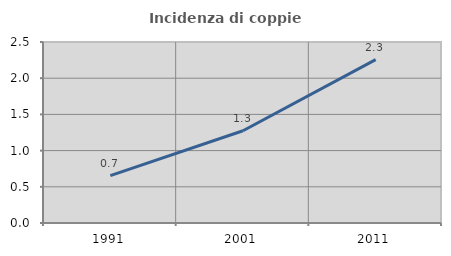
| Category | Incidenza di coppie miste |
|---|---|
| 1991.0 | 0.654 |
| 2001.0 | 1.274 |
| 2011.0 | 2.256 |